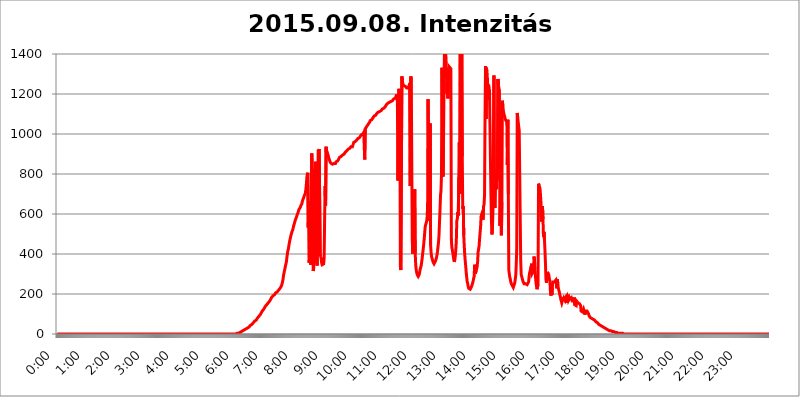
| Category | 2015.09.08. Intenzitás [W/m^2] |
|---|---|
| 0.0 | 0 |
| 0.0006944444444444445 | 0 |
| 0.001388888888888889 | 0 |
| 0.0020833333333333333 | 0 |
| 0.002777777777777778 | 0 |
| 0.003472222222222222 | 0 |
| 0.004166666666666667 | 0 |
| 0.004861111111111111 | 0 |
| 0.005555555555555556 | 0 |
| 0.0062499999999999995 | 0 |
| 0.006944444444444444 | 0 |
| 0.007638888888888889 | 0 |
| 0.008333333333333333 | 0 |
| 0.009027777777777779 | 0 |
| 0.009722222222222222 | 0 |
| 0.010416666666666666 | 0 |
| 0.011111111111111112 | 0 |
| 0.011805555555555555 | 0 |
| 0.012499999999999999 | 0 |
| 0.013194444444444444 | 0 |
| 0.013888888888888888 | 0 |
| 0.014583333333333332 | 0 |
| 0.015277777777777777 | 0 |
| 0.015972222222222224 | 0 |
| 0.016666666666666666 | 0 |
| 0.017361111111111112 | 0 |
| 0.018055555555555557 | 0 |
| 0.01875 | 0 |
| 0.019444444444444445 | 0 |
| 0.02013888888888889 | 0 |
| 0.020833333333333332 | 0 |
| 0.02152777777777778 | 0 |
| 0.022222222222222223 | 0 |
| 0.02291666666666667 | 0 |
| 0.02361111111111111 | 0 |
| 0.024305555555555556 | 0 |
| 0.024999999999999998 | 0 |
| 0.025694444444444447 | 0 |
| 0.02638888888888889 | 0 |
| 0.027083333333333334 | 0 |
| 0.027777777777777776 | 0 |
| 0.02847222222222222 | 0 |
| 0.029166666666666664 | 0 |
| 0.029861111111111113 | 0 |
| 0.030555555555555555 | 0 |
| 0.03125 | 0 |
| 0.03194444444444445 | 0 |
| 0.03263888888888889 | 0 |
| 0.03333333333333333 | 0 |
| 0.034027777777777775 | 0 |
| 0.034722222222222224 | 0 |
| 0.035416666666666666 | 0 |
| 0.036111111111111115 | 0 |
| 0.03680555555555556 | 0 |
| 0.0375 | 0 |
| 0.03819444444444444 | 0 |
| 0.03888888888888889 | 0 |
| 0.03958333333333333 | 0 |
| 0.04027777777777778 | 0 |
| 0.04097222222222222 | 0 |
| 0.041666666666666664 | 0 |
| 0.042361111111111106 | 0 |
| 0.04305555555555556 | 0 |
| 0.043750000000000004 | 0 |
| 0.044444444444444446 | 0 |
| 0.04513888888888889 | 0 |
| 0.04583333333333334 | 0 |
| 0.04652777777777778 | 0 |
| 0.04722222222222222 | 0 |
| 0.04791666666666666 | 0 |
| 0.04861111111111111 | 0 |
| 0.049305555555555554 | 0 |
| 0.049999999999999996 | 0 |
| 0.05069444444444445 | 0 |
| 0.051388888888888894 | 0 |
| 0.052083333333333336 | 0 |
| 0.05277777777777778 | 0 |
| 0.05347222222222222 | 0 |
| 0.05416666666666667 | 0 |
| 0.05486111111111111 | 0 |
| 0.05555555555555555 | 0 |
| 0.05625 | 0 |
| 0.05694444444444444 | 0 |
| 0.057638888888888885 | 0 |
| 0.05833333333333333 | 0 |
| 0.05902777777777778 | 0 |
| 0.059722222222222225 | 0 |
| 0.06041666666666667 | 0 |
| 0.061111111111111116 | 0 |
| 0.06180555555555556 | 0 |
| 0.0625 | 0 |
| 0.06319444444444444 | 0 |
| 0.06388888888888888 | 0 |
| 0.06458333333333334 | 0 |
| 0.06527777777777778 | 0 |
| 0.06597222222222222 | 0 |
| 0.06666666666666667 | 0 |
| 0.06736111111111111 | 0 |
| 0.06805555555555555 | 0 |
| 0.06874999999999999 | 0 |
| 0.06944444444444443 | 0 |
| 0.07013888888888889 | 0 |
| 0.07083333333333333 | 0 |
| 0.07152777777777779 | 0 |
| 0.07222222222222223 | 0 |
| 0.07291666666666667 | 0 |
| 0.07361111111111111 | 0 |
| 0.07430555555555556 | 0 |
| 0.075 | 0 |
| 0.07569444444444444 | 0 |
| 0.0763888888888889 | 0 |
| 0.07708333333333334 | 0 |
| 0.07777777777777778 | 0 |
| 0.07847222222222222 | 0 |
| 0.07916666666666666 | 0 |
| 0.0798611111111111 | 0 |
| 0.08055555555555556 | 0 |
| 0.08125 | 0 |
| 0.08194444444444444 | 0 |
| 0.08263888888888889 | 0 |
| 0.08333333333333333 | 0 |
| 0.08402777777777777 | 0 |
| 0.08472222222222221 | 0 |
| 0.08541666666666665 | 0 |
| 0.08611111111111112 | 0 |
| 0.08680555555555557 | 0 |
| 0.08750000000000001 | 0 |
| 0.08819444444444445 | 0 |
| 0.08888888888888889 | 0 |
| 0.08958333333333333 | 0 |
| 0.09027777777777778 | 0 |
| 0.09097222222222222 | 0 |
| 0.09166666666666667 | 0 |
| 0.09236111111111112 | 0 |
| 0.09305555555555556 | 0 |
| 0.09375 | 0 |
| 0.09444444444444444 | 0 |
| 0.09513888888888888 | 0 |
| 0.09583333333333333 | 0 |
| 0.09652777777777777 | 0 |
| 0.09722222222222222 | 0 |
| 0.09791666666666667 | 0 |
| 0.09861111111111111 | 0 |
| 0.09930555555555555 | 0 |
| 0.09999999999999999 | 0 |
| 0.10069444444444443 | 0 |
| 0.1013888888888889 | 0 |
| 0.10208333333333335 | 0 |
| 0.10277777777777779 | 0 |
| 0.10347222222222223 | 0 |
| 0.10416666666666667 | 0 |
| 0.10486111111111111 | 0 |
| 0.10555555555555556 | 0 |
| 0.10625 | 0 |
| 0.10694444444444444 | 0 |
| 0.1076388888888889 | 0 |
| 0.10833333333333334 | 0 |
| 0.10902777777777778 | 0 |
| 0.10972222222222222 | 0 |
| 0.1111111111111111 | 0 |
| 0.11180555555555556 | 0 |
| 0.11180555555555556 | 0 |
| 0.1125 | 0 |
| 0.11319444444444444 | 0 |
| 0.11388888888888889 | 0 |
| 0.11458333333333333 | 0 |
| 0.11527777777777777 | 0 |
| 0.11597222222222221 | 0 |
| 0.11666666666666665 | 0 |
| 0.1173611111111111 | 0 |
| 0.11805555555555557 | 0 |
| 0.11944444444444445 | 0 |
| 0.12013888888888889 | 0 |
| 0.12083333333333333 | 0 |
| 0.12152777777777778 | 0 |
| 0.12222222222222223 | 0 |
| 0.12291666666666667 | 0 |
| 0.12291666666666667 | 0 |
| 0.12361111111111112 | 0 |
| 0.12430555555555556 | 0 |
| 0.125 | 0 |
| 0.12569444444444444 | 0 |
| 0.12638888888888888 | 0 |
| 0.12708333333333333 | 0 |
| 0.16875 | 0 |
| 0.12847222222222224 | 0 |
| 0.12916666666666668 | 0 |
| 0.12986111111111112 | 0 |
| 0.13055555555555556 | 0 |
| 0.13125 | 0 |
| 0.13194444444444445 | 0 |
| 0.1326388888888889 | 0 |
| 0.13333333333333333 | 0 |
| 0.13402777777777777 | 0 |
| 0.13402777777777777 | 0 |
| 0.13472222222222222 | 0 |
| 0.13541666666666666 | 0 |
| 0.1361111111111111 | 0 |
| 0.13749999999999998 | 0 |
| 0.13819444444444443 | 0 |
| 0.1388888888888889 | 0 |
| 0.13958333333333334 | 0 |
| 0.14027777777777778 | 0 |
| 0.14097222222222222 | 0 |
| 0.14166666666666666 | 0 |
| 0.1423611111111111 | 0 |
| 0.14305555555555557 | 0 |
| 0.14375000000000002 | 0 |
| 0.14444444444444446 | 0 |
| 0.1451388888888889 | 0 |
| 0.1451388888888889 | 0 |
| 0.14652777777777778 | 0 |
| 0.14722222222222223 | 0 |
| 0.14791666666666667 | 0 |
| 0.1486111111111111 | 0 |
| 0.14930555555555555 | 0 |
| 0.15 | 0 |
| 0.15069444444444444 | 0 |
| 0.15138888888888888 | 0 |
| 0.15208333333333332 | 0 |
| 0.15277777777777776 | 0 |
| 0.15347222222222223 | 0 |
| 0.15416666666666667 | 0 |
| 0.15486111111111112 | 0 |
| 0.15555555555555556 | 0 |
| 0.15625 | 0 |
| 0.15694444444444444 | 0 |
| 0.15763888888888888 | 0 |
| 0.15833333333333333 | 0 |
| 0.15902777777777777 | 0 |
| 0.15972222222222224 | 0 |
| 0.16041666666666668 | 0 |
| 0.16111111111111112 | 0 |
| 0.16180555555555556 | 0 |
| 0.1625 | 0 |
| 0.16319444444444445 | 0 |
| 0.1638888888888889 | 0 |
| 0.16458333333333333 | 0 |
| 0.16527777777777777 | 0 |
| 0.16597222222222222 | 0 |
| 0.16666666666666666 | 0 |
| 0.1673611111111111 | 0 |
| 0.16805555555555554 | 0 |
| 0.16874999999999998 | 0 |
| 0.16944444444444443 | 0 |
| 0.17013888888888887 | 0 |
| 0.1708333333333333 | 0 |
| 0.17152777777777775 | 0 |
| 0.17222222222222225 | 0 |
| 0.1729166666666667 | 0 |
| 0.17361111111111113 | 0 |
| 0.17430555555555557 | 0 |
| 0.17500000000000002 | 0 |
| 0.17569444444444446 | 0 |
| 0.1763888888888889 | 0 |
| 0.17708333333333334 | 0 |
| 0.17777777777777778 | 0 |
| 0.17847222222222223 | 0 |
| 0.17916666666666667 | 0 |
| 0.1798611111111111 | 0 |
| 0.18055555555555555 | 0 |
| 0.18125 | 0 |
| 0.18194444444444444 | 0 |
| 0.1826388888888889 | 0 |
| 0.18333333333333335 | 0 |
| 0.1840277777777778 | 0 |
| 0.18472222222222223 | 0 |
| 0.18541666666666667 | 0 |
| 0.18611111111111112 | 0 |
| 0.18680555555555556 | 0 |
| 0.1875 | 0 |
| 0.18819444444444444 | 0 |
| 0.18888888888888888 | 0 |
| 0.18958333333333333 | 0 |
| 0.19027777777777777 | 0 |
| 0.1909722222222222 | 0 |
| 0.19166666666666665 | 0 |
| 0.19236111111111112 | 0 |
| 0.19305555555555554 | 0 |
| 0.19375 | 0 |
| 0.19444444444444445 | 0 |
| 0.1951388888888889 | 0 |
| 0.19583333333333333 | 0 |
| 0.19652777777777777 | 0 |
| 0.19722222222222222 | 0 |
| 0.19791666666666666 | 0 |
| 0.1986111111111111 | 0 |
| 0.19930555555555554 | 0 |
| 0.19999999999999998 | 0 |
| 0.20069444444444443 | 0 |
| 0.20138888888888887 | 0 |
| 0.2020833333333333 | 0 |
| 0.2027777777777778 | 0 |
| 0.2034722222222222 | 0 |
| 0.2041666666666667 | 0 |
| 0.20486111111111113 | 0 |
| 0.20555555555555557 | 0 |
| 0.20625000000000002 | 0 |
| 0.20694444444444446 | 0 |
| 0.2076388888888889 | 0 |
| 0.20833333333333334 | 0 |
| 0.20902777777777778 | 0 |
| 0.20972222222222223 | 0 |
| 0.21041666666666667 | 0 |
| 0.2111111111111111 | 0 |
| 0.21180555555555555 | 0 |
| 0.2125 | 0 |
| 0.21319444444444444 | 0 |
| 0.2138888888888889 | 0 |
| 0.21458333333333335 | 0 |
| 0.2152777777777778 | 0 |
| 0.21597222222222223 | 0 |
| 0.21666666666666667 | 0 |
| 0.21736111111111112 | 0 |
| 0.21805555555555556 | 0 |
| 0.21875 | 0 |
| 0.21944444444444444 | 0 |
| 0.22013888888888888 | 0 |
| 0.22083333333333333 | 0 |
| 0.22152777777777777 | 0 |
| 0.2222222222222222 | 0 |
| 0.22291666666666665 | 0 |
| 0.2236111111111111 | 0 |
| 0.22430555555555556 | 0 |
| 0.225 | 0 |
| 0.22569444444444445 | 0 |
| 0.2263888888888889 | 0 |
| 0.22708333333333333 | 0 |
| 0.22777777777777777 | 0 |
| 0.22847222222222222 | 0 |
| 0.22916666666666666 | 0 |
| 0.2298611111111111 | 0 |
| 0.23055555555555554 | 0 |
| 0.23124999999999998 | 0 |
| 0.23194444444444443 | 0 |
| 0.23263888888888887 | 0 |
| 0.2333333333333333 | 0 |
| 0.2340277777777778 | 0 |
| 0.2347222222222222 | 0 |
| 0.2354166666666667 | 0 |
| 0.23611111111111113 | 0 |
| 0.23680555555555557 | 0 |
| 0.23750000000000002 | 0 |
| 0.23819444444444446 | 0 |
| 0.2388888888888889 | 0 |
| 0.23958333333333334 | 0 |
| 0.24027777777777778 | 0 |
| 0.24097222222222223 | 0 |
| 0.24166666666666667 | 0 |
| 0.2423611111111111 | 0 |
| 0.24305555555555555 | 0 |
| 0.24375 | 0 |
| 0.24444444444444446 | 0 |
| 0.24513888888888888 | 0 |
| 0.24583333333333335 | 0 |
| 0.2465277777777778 | 0 |
| 0.24722222222222223 | 0 |
| 0.24791666666666667 | 0 |
| 0.24861111111111112 | 0 |
| 0.24930555555555556 | 0 |
| 0.25 | 0 |
| 0.25069444444444444 | 0 |
| 0.2513888888888889 | 3.525 |
| 0.2520833333333333 | 3.525 |
| 0.25277777777777777 | 3.525 |
| 0.2534722222222222 | 3.525 |
| 0.25416666666666665 | 3.525 |
| 0.2548611111111111 | 3.525 |
| 0.2555555555555556 | 7.887 |
| 0.25625000000000003 | 7.887 |
| 0.2569444444444445 | 7.887 |
| 0.2576388888888889 | 12.257 |
| 0.25833333333333336 | 12.257 |
| 0.2590277777777778 | 12.257 |
| 0.25972222222222224 | 12.257 |
| 0.2604166666666667 | 16.636 |
| 0.2611111111111111 | 16.636 |
| 0.26180555555555557 | 21.024 |
| 0.2625 | 21.024 |
| 0.26319444444444445 | 21.024 |
| 0.2638888888888889 | 21.024 |
| 0.26458333333333334 | 25.419 |
| 0.2652777777777778 | 25.419 |
| 0.2659722222222222 | 29.823 |
| 0.26666666666666666 | 29.823 |
| 0.2673611111111111 | 29.823 |
| 0.26805555555555555 | 34.234 |
| 0.26875 | 34.234 |
| 0.26944444444444443 | 38.653 |
| 0.2701388888888889 | 38.653 |
| 0.2708333333333333 | 43.079 |
| 0.27152777777777776 | 43.079 |
| 0.2722222222222222 | 47.511 |
| 0.27291666666666664 | 47.511 |
| 0.2736111111111111 | 51.951 |
| 0.2743055555555555 | 51.951 |
| 0.27499999999999997 | 56.398 |
| 0.27569444444444446 | 60.85 |
| 0.27638888888888885 | 60.85 |
| 0.27708333333333335 | 65.31 |
| 0.2777777777777778 | 65.31 |
| 0.27847222222222223 | 69.775 |
| 0.2791666666666667 | 69.775 |
| 0.2798611111111111 | 74.246 |
| 0.28055555555555556 | 78.722 |
| 0.28125 | 83.205 |
| 0.28194444444444444 | 83.205 |
| 0.2826388888888889 | 87.692 |
| 0.2833333333333333 | 92.184 |
| 0.28402777777777777 | 92.184 |
| 0.2847222222222222 | 96.682 |
| 0.28541666666666665 | 101.184 |
| 0.28611111111111115 | 105.69 |
| 0.28680555555555554 | 110.201 |
| 0.28750000000000003 | 114.716 |
| 0.2881944444444445 | 119.235 |
| 0.2888888888888889 | 119.235 |
| 0.28958333333333336 | 123.758 |
| 0.2902777777777778 | 128.284 |
| 0.29097222222222224 | 128.284 |
| 0.2916666666666667 | 137.347 |
| 0.2923611111111111 | 137.347 |
| 0.29305555555555557 | 141.884 |
| 0.29375 | 146.423 |
| 0.29444444444444445 | 146.423 |
| 0.2951388888888889 | 150.964 |
| 0.29583333333333334 | 155.509 |
| 0.2965277777777778 | 155.509 |
| 0.2972222222222222 | 160.056 |
| 0.29791666666666666 | 164.605 |
| 0.2986111111111111 | 169.156 |
| 0.29930555555555555 | 173.709 |
| 0.3 | 178.264 |
| 0.30069444444444443 | 182.82 |
| 0.3013888888888889 | 182.82 |
| 0.3020833333333333 | 187.378 |
| 0.30277777777777776 | 191.937 |
| 0.3034722222222222 | 196.497 |
| 0.30416666666666664 | 196.497 |
| 0.3048611111111111 | 196.497 |
| 0.3055555555555555 | 201.058 |
| 0.30624999999999997 | 205.62 |
| 0.3069444444444444 | 205.62 |
| 0.3076388888888889 | 210.182 |
| 0.30833333333333335 | 210.182 |
| 0.3090277777777778 | 210.182 |
| 0.30972222222222223 | 210.182 |
| 0.3104166666666667 | 219.309 |
| 0.3111111111111111 | 219.309 |
| 0.31180555555555556 | 223.873 |
| 0.3125 | 228.436 |
| 0.31319444444444444 | 233 |
| 0.3138888888888889 | 233 |
| 0.3145833333333333 | 242.127 |
| 0.31527777777777777 | 251.251 |
| 0.3159722222222222 | 260.373 |
| 0.31666666666666665 | 274.047 |
| 0.31736111111111115 | 292.259 |
| 0.31805555555555554 | 305.898 |
| 0.31875000000000003 | 310.44 |
| 0.3194444444444445 | 328.584 |
| 0.3201388888888889 | 342.162 |
| 0.32083333333333336 | 351.198 |
| 0.3215277777777778 | 364.728 |
| 0.32222222222222224 | 387.202 |
| 0.3229166666666667 | 405.108 |
| 0.3236111111111111 | 418.492 |
| 0.32430555555555557 | 427.39 |
| 0.325 | 445.129 |
| 0.32569444444444445 | 458.38 |
| 0.3263888888888889 | 471.582 |
| 0.32708333333333334 | 475.972 |
| 0.3277777777777778 | 493.475 |
| 0.3284722222222222 | 502.192 |
| 0.32916666666666666 | 510.885 |
| 0.3298611111111111 | 515.223 |
| 0.33055555555555555 | 523.88 |
| 0.33125 | 536.82 |
| 0.33194444444444443 | 545.416 |
| 0.3326388888888889 | 553.986 |
| 0.3333333333333333 | 562.53 |
| 0.3340277777777778 | 571.049 |
| 0.3347222222222222 | 575.299 |
| 0.3354166666666667 | 583.779 |
| 0.3361111111111111 | 592.233 |
| 0.3368055555555556 | 596.45 |
| 0.33749999999999997 | 604.864 |
| 0.33819444444444446 | 609.062 |
| 0.33888888888888885 | 621.613 |
| 0.33958333333333335 | 621.613 |
| 0.34027777777777773 | 625.784 |
| 0.34097222222222223 | 634.105 |
| 0.3416666666666666 | 642.4 |
| 0.3423611111111111 | 646.537 |
| 0.3430555555555555 | 650.667 |
| 0.34375 | 663.019 |
| 0.3444444444444445 | 671.22 |
| 0.3451388888888889 | 667.123 |
| 0.3458333333333334 | 683.473 |
| 0.34652777777777777 | 691.608 |
| 0.34722222222222227 | 687.544 |
| 0.34791666666666665 | 703.762 |
| 0.34861111111111115 | 719.877 |
| 0.34930555555555554 | 743.859 |
| 0.35000000000000003 | 779.42 |
| 0.3506944444444444 | 798.974 |
| 0.3513888888888889 | 806.757 |
| 0.3520833333333333 | 532.513 |
| 0.3527777777777778 | 663.019 |
| 0.3534722222222222 | 355.712 |
| 0.3541666666666667 | 422.943 |
| 0.3548611111111111 | 369.23 |
| 0.35555555555555557 | 346.682 |
| 0.35625 | 342.162 |
| 0.35694444444444445 | 902.447 |
| 0.3576388888888889 | 802.868 |
| 0.35833333333333334 | 549.704 |
| 0.3590277777777778 | 314.98 |
| 0.3597222222222222 | 333.113 |
| 0.36041666666666666 | 822.26 |
| 0.3611111111111111 | 695.666 |
| 0.36180555555555555 | 440.702 |
| 0.3625 | 860.676 |
| 0.36319444444444443 | 378.224 |
| 0.3638888888888889 | 351.198 |
| 0.3645833333333333 | 342.162 |
| 0.3652777777777778 | 480.356 |
| 0.3659722222222222 | 921.298 |
| 0.3666666666666667 | 913.766 |
| 0.3673611111111111 | 925.06 |
| 0.3680555555555556 | 928.819 |
| 0.36874999999999997 | 405.108 |
| 0.36944444444444446 | 387.202 |
| 0.37013888888888885 | 378.224 |
| 0.37083333333333335 | 355.712 |
| 0.37152777777777773 | 346.682 |
| 0.37222222222222223 | 346.682 |
| 0.3729166666666666 | 351.198 |
| 0.3736111111111111 | 351.198 |
| 0.3743055555555555 | 378.224 |
| 0.375 | 575.299 |
| 0.3756944444444445 | 739.877 |
| 0.3763888888888889 | 642.4 |
| 0.3770833333333334 | 936.33 |
| 0.37777777777777777 | 887.309 |
| 0.37847222222222227 | 894.885 |
| 0.37916666666666665 | 902.447 |
| 0.37986111111111115 | 894.885 |
| 0.38055555555555554 | 883.516 |
| 0.38125000000000003 | 879.719 |
| 0.3819444444444444 | 868.305 |
| 0.3826388888888889 | 860.676 |
| 0.3833333333333333 | 860.676 |
| 0.3840277777777778 | 853.029 |
| 0.3847222222222222 | 853.029 |
| 0.3854166666666667 | 853.029 |
| 0.3861111111111111 | 849.199 |
| 0.38680555555555557 | 849.199 |
| 0.3875 | 849.199 |
| 0.38819444444444445 | 853.029 |
| 0.3888888888888889 | 853.029 |
| 0.38958333333333334 | 853.029 |
| 0.3902777777777778 | 853.029 |
| 0.3909722222222222 | 860.676 |
| 0.39166666666666666 | 860.676 |
| 0.3923611111111111 | 864.493 |
| 0.39305555555555555 | 864.493 |
| 0.39375 | 868.305 |
| 0.39444444444444443 | 872.114 |
| 0.3951388888888889 | 875.918 |
| 0.3958333333333333 | 883.516 |
| 0.3965277777777778 | 883.516 |
| 0.3972222222222222 | 883.516 |
| 0.3979166666666667 | 887.309 |
| 0.3986111111111111 | 887.309 |
| 0.3993055555555556 | 887.309 |
| 0.39999999999999997 | 894.885 |
| 0.40069444444444446 | 894.885 |
| 0.40138888888888885 | 898.668 |
| 0.40208333333333335 | 898.668 |
| 0.40277777777777773 | 898.668 |
| 0.40347222222222223 | 902.447 |
| 0.4041666666666666 | 909.996 |
| 0.4048611111111111 | 906.223 |
| 0.4055555555555555 | 913.766 |
| 0.40625 | 917.534 |
| 0.4069444444444445 | 921.298 |
| 0.4076388888888889 | 921.298 |
| 0.4083333333333334 | 925.06 |
| 0.40902777777777777 | 925.06 |
| 0.40972222222222227 | 925.06 |
| 0.41041666666666665 | 928.819 |
| 0.41111111111111115 | 928.819 |
| 0.41180555555555554 | 936.33 |
| 0.41250000000000003 | 940.082 |
| 0.4131944444444444 | 936.33 |
| 0.4138888888888889 | 936.33 |
| 0.4145833333333333 | 943.832 |
| 0.4152777777777778 | 947.58 |
| 0.4159722222222222 | 958.814 |
| 0.4166666666666667 | 958.814 |
| 0.4173611111111111 | 958.814 |
| 0.41805555555555557 | 962.555 |
| 0.41875 | 966.295 |
| 0.41944444444444445 | 966.295 |
| 0.4201388888888889 | 970.034 |
| 0.42083333333333334 | 973.772 |
| 0.4215277777777778 | 977.508 |
| 0.4222222222222222 | 977.508 |
| 0.42291666666666666 | 981.244 |
| 0.4236111111111111 | 981.244 |
| 0.42430555555555555 | 981.244 |
| 0.425 | 988.714 |
| 0.42569444444444443 | 992.448 |
| 0.4263888888888889 | 996.182 |
| 0.4270833333333333 | 999.916 |
| 0.4277777777777778 | 999.916 |
| 0.4284722222222222 | 999.916 |
| 0.4291666666666667 | 1003.65 |
| 0.4298611111111111 | 1007.383 |
| 0.4305555555555556 | 1011.118 |
| 0.43124999999999997 | 872.114 |
| 0.43194444444444446 | 1026.06 |
| 0.43263888888888885 | 1029.798 |
| 0.43333333333333335 | 1033.537 |
| 0.43402777777777773 | 1037.277 |
| 0.43472222222222223 | 1041.019 |
| 0.4354166666666666 | 1044.762 |
| 0.4361111111111111 | 1048.508 |
| 0.4368055555555555 | 1052.255 |
| 0.4375 | 1052.255 |
| 0.4381944444444445 | 1059.756 |
| 0.4388888888888889 | 1067.267 |
| 0.4395833333333334 | 1063.51 |
| 0.44027777777777777 | 1067.267 |
| 0.44097222222222227 | 1071.027 |
| 0.44166666666666665 | 1074.789 |
| 0.44236111111111115 | 1078.555 |
| 0.44305555555555554 | 1078.555 |
| 0.44375000000000003 | 1082.324 |
| 0.4444444444444444 | 1089.873 |
| 0.4451388888888889 | 1089.873 |
| 0.4458333333333333 | 1089.873 |
| 0.4465277777777778 | 1093.653 |
| 0.4472222222222222 | 1097.437 |
| 0.4479166666666667 | 1101.226 |
| 0.4486111111111111 | 1105.019 |
| 0.44930555555555557 | 1105.019 |
| 0.45 | 1108.816 |
| 0.45069444444444445 | 1108.816 |
| 0.4513888888888889 | 1108.816 |
| 0.45208333333333334 | 1112.618 |
| 0.4527777777777778 | 1116.426 |
| 0.4534722222222222 | 1112.618 |
| 0.45416666666666666 | 1116.426 |
| 0.4548611111111111 | 1120.238 |
| 0.45555555555555555 | 1124.056 |
| 0.45625 | 1124.056 |
| 0.45694444444444443 | 1127.879 |
| 0.4576388888888889 | 1127.879 |
| 0.4583333333333333 | 1131.708 |
| 0.4590277777777778 | 1131.708 |
| 0.4597222222222222 | 1135.543 |
| 0.4604166666666667 | 1139.384 |
| 0.4611111111111111 | 1139.384 |
| 0.4618055555555556 | 1147.086 |
| 0.46249999999999997 | 1147.086 |
| 0.46319444444444446 | 1147.086 |
| 0.46388888888888885 | 1154.814 |
| 0.46458333333333335 | 1154.814 |
| 0.46527777777777773 | 1158.689 |
| 0.46597222222222223 | 1158.689 |
| 0.4666666666666666 | 1162.571 |
| 0.4673611111111111 | 1162.571 |
| 0.4680555555555555 | 1162.571 |
| 0.46875 | 1158.689 |
| 0.4694444444444445 | 1158.689 |
| 0.4701388888888889 | 1166.46 |
| 0.4708333333333334 | 1170.358 |
| 0.47152777777777777 | 1174.263 |
| 0.47222222222222227 | 1174.263 |
| 0.47291666666666665 | 1174.263 |
| 0.47361111111111115 | 1178.177 |
| 0.47430555555555554 | 1178.177 |
| 0.47500000000000003 | 1186.03 |
| 0.4756944444444444 | 1197.876 |
| 0.4763888888888889 | 1201.843 |
| 0.4770833333333333 | 1166.46 |
| 0.4777777777777778 | 767.62 |
| 0.4784722222222222 | 992.448 |
| 0.4791666666666667 | 1225.859 |
| 0.4798611111111111 | 1225.859 |
| 0.48055555555555557 | 1078.555 |
| 0.48125 | 337.639 |
| 0.48194444444444445 | 319.517 |
| 0.4826388888888889 | 324.052 |
| 0.48333333333333334 | 1287.761 |
| 0.4840277777777778 | 1266.8 |
| 0.4847222222222222 | 1250.275 |
| 0.48541666666666666 | 1246.176 |
| 0.4861111111111111 | 1242.089 |
| 0.48680555555555555 | 1246.176 |
| 0.4875 | 1238.014 |
| 0.48819444444444443 | 1238.014 |
| 0.4888888888888889 | 1238.014 |
| 0.4895833333333333 | 1233.951 |
| 0.4902777777777778 | 1229.899 |
| 0.4909722222222222 | 1225.859 |
| 0.4916666666666667 | 1225.859 |
| 0.4923611111111111 | 1229.899 |
| 0.4930555555555556 | 1233.951 |
| 0.49374999999999997 | 1246.176 |
| 0.49444444444444446 | 1254.387 |
| 0.49513888888888885 | 739.877 |
| 0.49583333333333335 | 1287.761 |
| 0.49652777777777773 | 1270.964 |
| 0.49722222222222223 | 1266.8 |
| 0.4979166666666666 | 471.582 |
| 0.4986111111111111 | 400.638 |
| 0.4993055555555555 | 471.582 |
| 0.5 | 484.735 |
| 0.5006944444444444 | 493.475 |
| 0.5013888888888889 | 723.889 |
| 0.5020833333333333 | 400.638 |
| 0.5027777777777778 | 346.682 |
| 0.5034722222222222 | 319.517 |
| 0.5041666666666667 | 305.898 |
| 0.5048611111111111 | 296.808 |
| 0.5055555555555555 | 292.259 |
| 0.50625 | 287.709 |
| 0.5069444444444444 | 292.259 |
| 0.5076388888888889 | 296.808 |
| 0.5083333333333333 | 310.44 |
| 0.5090277777777777 | 324.052 |
| 0.5097222222222222 | 333.113 |
| 0.5104166666666666 | 342.162 |
| 0.5111111111111112 | 360.221 |
| 0.5118055555555555 | 378.224 |
| 0.5125000000000001 | 400.638 |
| 0.5131944444444444 | 422.943 |
| 0.513888888888889 | 445.129 |
| 0.5145833333333333 | 471.582 |
| 0.5152777777777778 | 502.192 |
| 0.5159722222222222 | 532.513 |
| 0.5166666666666667 | 545.416 |
| 0.517361111111111 | 553.986 |
| 0.5180555555555556 | 562.53 |
| 0.5187499999999999 | 583.779 |
| 0.5194444444444445 | 638.256 |
| 0.5201388888888888 | 1174.263 |
| 0.5208333333333334 | 634.105 |
| 0.5215277777777778 | 629.948 |
| 0.5222222222222223 | 566.793 |
| 0.5229166666666667 | 1052.255 |
| 0.5236111111111111 | 445.129 |
| 0.5243055555555556 | 409.574 |
| 0.525 | 387.202 |
| 0.5256944444444445 | 378.224 |
| 0.5263888888888889 | 369.23 |
| 0.5270833333333333 | 360.221 |
| 0.5277777777777778 | 360.221 |
| 0.5284722222222222 | 351.198 |
| 0.5291666666666667 | 351.198 |
| 0.5298611111111111 | 355.712 |
| 0.5305555555555556 | 364.728 |
| 0.53125 | 373.729 |
| 0.5319444444444444 | 382.715 |
| 0.5326388888888889 | 396.164 |
| 0.5333333333333333 | 414.035 |
| 0.5340277777777778 | 436.27 |
| 0.5347222222222222 | 458.38 |
| 0.5354166666666667 | 493.475 |
| 0.5361111111111111 | 558.261 |
| 0.5368055555555555 | 617.436 |
| 0.5375 | 691.608 |
| 0.5381944444444444 | 715.858 |
| 0.5388888888888889 | 795.074 |
| 0.5395833333333333 | 1330.826 |
| 0.5402777777777777 | 1330.826 |
| 0.5409722222222222 | 787.258 |
| 0.5416666666666666 | 936.33 |
| 0.5423611111111112 | 1201.843 |
| 0.5430555555555555 | 1422.462 |
| 0.5437500000000001 | 1436.949 |
| 0.5444444444444444 | 1408.184 |
| 0.545138888888889 | 1384.828 |
| 0.5458333333333333 | 1326.445 |
| 0.5465277777777778 | 1201.843 |
| 0.5472222222222222 | 1330.826 |
| 0.5479166666666667 | 1178.177 |
| 0.548611111111111 | 1287.761 |
| 0.5493055555555556 | 1279.334 |
| 0.5499999999999999 | 1335.223 |
| 0.5506944444444445 | 1339.639 |
| 0.5513888888888888 | 1339.639 |
| 0.5520833333333334 | 1326.445 |
| 0.5527777777777778 | 471.582 |
| 0.5534722222222223 | 431.833 |
| 0.5541666666666667 | 418.492 |
| 0.5548611111111111 | 405.108 |
| 0.5555555555555556 | 387.202 |
| 0.55625 | 369.23 |
| 0.5569444444444445 | 360.221 |
| 0.5576388888888889 | 373.729 |
| 0.5583333333333333 | 391.685 |
| 0.5590277777777778 | 422.943 |
| 0.5597222222222222 | 467.187 |
| 0.5604166666666667 | 566.793 |
| 0.5611111111111111 | 575.299 |
| 0.5618055555555556 | 609.062 |
| 0.5625 | 592.233 |
| 0.5631944444444444 | 783.342 |
| 0.5638888888888889 | 958.814 |
| 0.5645833333333333 | 699.717 |
| 0.5652777777777778 | 1461.58 |
| 0.5659722222222222 | 887.309 |
| 0.5666666666666667 | 1143.232 |
| 0.5673611111111111 | 1422.462 |
| 0.5680555555555555 | 887.309 |
| 0.56875 | 625.784 |
| 0.5694444444444444 | 638.256 |
| 0.5701388888888889 | 493.475 |
| 0.5708333333333333 | 440.702 |
| 0.5715277777777777 | 396.164 |
| 0.5722222222222222 | 364.728 |
| 0.5729166666666666 | 337.639 |
| 0.5736111111111112 | 305.898 |
| 0.5743055555555555 | 283.156 |
| 0.5750000000000001 | 260.373 |
| 0.5756944444444444 | 251.251 |
| 0.576388888888889 | 237.564 |
| 0.5770833333333333 | 228.436 |
| 0.5777777777777778 | 223.873 |
| 0.5784722222222222 | 223.873 |
| 0.5791666666666667 | 223.873 |
| 0.579861111111111 | 223.873 |
| 0.5805555555555556 | 233 |
| 0.5812499999999999 | 237.564 |
| 0.5819444444444445 | 246.689 |
| 0.5826388888888888 | 251.251 |
| 0.5833333333333334 | 264.932 |
| 0.5840277777777778 | 278.603 |
| 0.5847222222222223 | 287.709 |
| 0.5854166666666667 | 346.682 |
| 0.5861111111111111 | 301.354 |
| 0.5868055555555556 | 305.898 |
| 0.5875 | 314.98 |
| 0.5881944444444445 | 324.052 |
| 0.5888888888888889 | 337.639 |
| 0.5895833333333333 | 360.221 |
| 0.5902777777777778 | 409.574 |
| 0.5909722222222222 | 405.108 |
| 0.5916666666666667 | 440.702 |
| 0.5923611111111111 | 475.972 |
| 0.5930555555555556 | 506.542 |
| 0.59375 | 536.82 |
| 0.5944444444444444 | 588.009 |
| 0.5951388888888889 | 596.45 |
| 0.5958333333333333 | 600.661 |
| 0.5965277777777778 | 579.542 |
| 0.5972222222222222 | 571.049 |
| 0.5979166666666667 | 638.256 |
| 0.5986111111111111 | 646.537 |
| 0.5993055555555555 | 695.666 |
| 0.6 | 1089.873 |
| 0.6006944444444444 | 1339.639 |
| 0.6013888888888889 | 1074.789 |
| 0.6020833333333333 | 1330.826 |
| 0.6027777777777777 | 1291.997 |
| 0.6034722222222222 | 1275.142 |
| 0.6041666666666666 | 1170.358 |
| 0.6048611111111112 | 1246.176 |
| 0.6055555555555555 | 1229.899 |
| 0.6062500000000001 | 1217.812 |
| 0.6069444444444444 | 1213.804 |
| 0.607638888888889 | 853.029 |
| 0.6083333333333333 | 687.544 |
| 0.6090277777777778 | 558.261 |
| 0.6097222222222222 | 497.836 |
| 0.6104166666666667 | 536.82 |
| 0.611111111111111 | 617.436 |
| 0.6118055555555556 | 992.448 |
| 0.6124999999999999 | 1291.997 |
| 0.6131944444444445 | 654.791 |
| 0.6138888888888888 | 629.948 |
| 0.6145833333333334 | 791.169 |
| 0.6152777777777778 | 743.859 |
| 0.6159722222222223 | 723.889 |
| 0.6166666666666667 | 822.26 |
| 0.6173611111111111 | 771.559 |
| 0.6180555555555556 | 1275.142 |
| 0.61875 | 1242.089 |
| 0.6194444444444445 | 1242.089 |
| 0.6201388888888889 | 1217.812 |
| 0.6208333333333333 | 541.121 |
| 0.6215277777777778 | 638.256 |
| 0.6222222222222222 | 1003.65 |
| 0.6229166666666667 | 493.475 |
| 0.6236111111111111 | 658.909 |
| 0.6243055555555556 | 1166.46 |
| 0.625 | 1139.384 |
| 0.6256944444444444 | 1116.426 |
| 0.6263888888888889 | 1101.226 |
| 0.6270833333333333 | 1093.653 |
| 0.6277777777777778 | 1082.324 |
| 0.6284722222222222 | 1078.555 |
| 0.6291666666666667 | 1067.267 |
| 0.6298611111111111 | 1067.267 |
| 0.6305555555555555 | 1059.756 |
| 0.63125 | 845.365 |
| 0.6319444444444444 | 1071.027 |
| 0.6326388888888889 | 699.717 |
| 0.6333333333333333 | 319.517 |
| 0.6340277777777777 | 301.354 |
| 0.6347222222222222 | 283.156 |
| 0.6354166666666666 | 274.047 |
| 0.6361111111111112 | 260.373 |
| 0.6368055555555555 | 251.251 |
| 0.6375000000000001 | 246.689 |
| 0.6381944444444444 | 242.127 |
| 0.638888888888889 | 237.564 |
| 0.6395833333333333 | 233 |
| 0.6402777777777778 | 228.436 |
| 0.6409722222222222 | 233 |
| 0.6416666666666667 | 255.813 |
| 0.642361111111111 | 260.373 |
| 0.6430555555555556 | 292.259 |
| 0.6437499999999999 | 346.682 |
| 0.6444444444444445 | 427.39 |
| 0.6451388888888888 | 1105.019 |
| 0.6458333333333334 | 1082.324 |
| 0.6465277777777778 | 1059.756 |
| 0.6472222222222223 | 1037.277 |
| 0.6479166666666667 | 1018.587 |
| 0.6486111111111111 | 1018.587 |
| 0.6493055555555556 | 1014.852 |
| 0.65 | 369.23 |
| 0.6506944444444445 | 296.808 |
| 0.6513888888888889 | 287.709 |
| 0.6520833333333333 | 278.603 |
| 0.6527777777777778 | 269.49 |
| 0.6534722222222222 | 260.373 |
| 0.6541666666666667 | 255.813 |
| 0.6548611111111111 | 251.251 |
| 0.6555555555555556 | 251.251 |
| 0.65625 | 251.251 |
| 0.6569444444444444 | 251.251 |
| 0.6576388888888889 | 251.251 |
| 0.6583333333333333 | 251.251 |
| 0.6590277777777778 | 246.689 |
| 0.6597222222222222 | 242.127 |
| 0.6604166666666667 | 251.251 |
| 0.6611111111111111 | 260.373 |
| 0.6618055555555555 | 287.709 |
| 0.6625 | 305.898 |
| 0.6631944444444444 | 314.98 |
| 0.6638888888888889 | 305.898 |
| 0.6645833333333333 | 310.44 |
| 0.6652777777777777 | 351.198 |
| 0.6659722222222222 | 301.354 |
| 0.6666666666666666 | 301.354 |
| 0.6673611111111111 | 310.44 |
| 0.6680555555555556 | 319.517 |
| 0.6687500000000001 | 387.202 |
| 0.6694444444444444 | 364.728 |
| 0.6701388888888888 | 319.517 |
| 0.6708333333333334 | 283.156 |
| 0.6715277777777778 | 255.813 |
| 0.6722222222222222 | 237.564 |
| 0.6729166666666666 | 223.873 |
| 0.6736111111111112 | 223.873 |
| 0.6743055555555556 | 246.689 |
| 0.6749999999999999 | 751.803 |
| 0.6756944444444444 | 743.859 |
| 0.6763888888888889 | 743.859 |
| 0.6770833333333334 | 727.896 |
| 0.6777777777777777 | 695.666 |
| 0.6784722222222223 | 654.791 |
| 0.6791666666666667 | 562.53 |
| 0.6798611111111111 | 621.613 |
| 0.6805555555555555 | 638.256 |
| 0.68125 | 575.299 |
| 0.6819444444444445 | 484.735 |
| 0.6826388888888889 | 510.885 |
| 0.6833333333333332 | 471.582 |
| 0.6840277777777778 | 418.492 |
| 0.6847222222222222 | 355.712 |
| 0.6854166666666667 | 274.047 |
| 0.686111111111111 | 255.813 |
| 0.6868055555555556 | 255.813 |
| 0.6875 | 310.44 |
| 0.6881944444444444 | 314.98 |
| 0.688888888888889 | 305.898 |
| 0.6895833333333333 | 292.259 |
| 0.6902777777777778 | 274.047 |
| 0.6909722222222222 | 264.932 |
| 0.6916666666666668 | 214.746 |
| 0.6923611111111111 | 191.937 |
| 0.6930555555555555 | 251.251 |
| 0.69375 | 196.497 |
| 0.6944444444444445 | 246.689 |
| 0.6951388888888889 | 260.373 |
| 0.6958333333333333 | 260.373 |
| 0.6965277777777777 | 260.373 |
| 0.6972222222222223 | 260.373 |
| 0.6979166666666666 | 260.373 |
| 0.6986111111111111 | 264.932 |
| 0.6993055555555556 | 269.49 |
| 0.7000000000000001 | 269.49 |
| 0.7006944444444444 | 228.436 |
| 0.7013888888888888 | 274.047 |
| 0.7020833333333334 | 251.251 |
| 0.7027777777777778 | 228.436 |
| 0.7034722222222222 | 219.309 |
| 0.7041666666666666 | 210.182 |
| 0.7048611111111112 | 196.497 |
| 0.7055555555555556 | 187.378 |
| 0.7062499999999999 | 173.709 |
| 0.7069444444444444 | 164.605 |
| 0.7076388888888889 | 155.509 |
| 0.7083333333333334 | 164.605 |
| 0.7090277777777777 | 182.82 |
| 0.7097222222222223 | 169.156 |
| 0.7104166666666667 | 178.264 |
| 0.7111111111111111 | 178.264 |
| 0.7118055555555555 | 169.156 |
| 0.7125 | 182.82 |
| 0.7131944444444445 | 178.264 |
| 0.7138888888888889 | 182.82 |
| 0.7145833333333332 | 191.937 |
| 0.7152777777777778 | 155.509 |
| 0.7159722222222222 | 155.509 |
| 0.7166666666666667 | 196.497 |
| 0.717361111111111 | 169.156 |
| 0.7180555555555556 | 173.709 |
| 0.71875 | 178.264 |
| 0.7194444444444444 | 182.82 |
| 0.720138888888889 | 182.82 |
| 0.7208333333333333 | 182.82 |
| 0.7215277777777778 | 173.709 |
| 0.7222222222222222 | 164.605 |
| 0.7229166666666668 | 164.605 |
| 0.7236111111111111 | 160.056 |
| 0.7243055555555555 | 164.605 |
| 0.725 | 182.82 |
| 0.7256944444444445 | 146.423 |
| 0.7263888888888889 | 150.964 |
| 0.7270833333333333 | 146.423 |
| 0.7277777777777777 | 141.884 |
| 0.7284722222222223 | 164.605 |
| 0.7291666666666666 | 169.156 |
| 0.7298611111111111 | 164.605 |
| 0.7305555555555556 | 155.509 |
| 0.7312500000000001 | 155.509 |
| 0.7319444444444444 | 150.964 |
| 0.7326388888888888 | 150.964 |
| 0.7333333333333334 | 150.964 |
| 0.7340277777777778 | 141.884 |
| 0.7347222222222222 | 114.716 |
| 0.7354166666666666 | 110.201 |
| 0.7361111111111112 | 110.201 |
| 0.7368055555555556 | 110.201 |
| 0.7374999999999999 | 110.201 |
| 0.7381944444444444 | 123.758 |
| 0.7388888888888889 | 123.758 |
| 0.7395833333333334 | 119.235 |
| 0.7402777777777777 | 96.682 |
| 0.7409722222222223 | 114.716 |
| 0.7416666666666667 | 114.716 |
| 0.7423611111111111 | 114.716 |
| 0.7430555555555555 | 114.716 |
| 0.74375 | 110.201 |
| 0.7444444444444445 | 110.201 |
| 0.7451388888888889 | 101.184 |
| 0.7458333333333332 | 92.184 |
| 0.7465277777777778 | 87.692 |
| 0.7472222222222222 | 83.205 |
| 0.7479166666666667 | 83.205 |
| 0.748611111111111 | 78.722 |
| 0.7493055555555556 | 78.722 |
| 0.75 | 74.246 |
| 0.7506944444444444 | 74.246 |
| 0.751388888888889 | 74.246 |
| 0.7520833333333333 | 74.246 |
| 0.7527777777777778 | 69.775 |
| 0.7534722222222222 | 69.775 |
| 0.7541666666666668 | 65.31 |
| 0.7548611111111111 | 65.31 |
| 0.7555555555555555 | 60.85 |
| 0.75625 | 56.398 |
| 0.7569444444444445 | 56.398 |
| 0.7576388888888889 | 56.398 |
| 0.7583333333333333 | 56.398 |
| 0.7590277777777777 | 51.951 |
| 0.7597222222222223 | 47.511 |
| 0.7604166666666666 | 47.511 |
| 0.7611111111111111 | 43.079 |
| 0.7618055555555556 | 43.079 |
| 0.7625000000000001 | 43.079 |
| 0.7631944444444444 | 38.653 |
| 0.7638888888888888 | 38.653 |
| 0.7645833333333334 | 34.234 |
| 0.7652777777777778 | 34.234 |
| 0.7659722222222222 | 34.234 |
| 0.7666666666666666 | 29.823 |
| 0.7673611111111112 | 29.823 |
| 0.7680555555555556 | 29.823 |
| 0.7687499999999999 | 29.823 |
| 0.7694444444444444 | 25.419 |
| 0.7701388888888889 | 25.419 |
| 0.7708333333333334 | 21.024 |
| 0.7715277777777777 | 21.024 |
| 0.7722222222222223 | 21.024 |
| 0.7729166666666667 | 21.024 |
| 0.7736111111111111 | 16.636 |
| 0.7743055555555555 | 16.636 |
| 0.775 | 16.636 |
| 0.7756944444444445 | 16.636 |
| 0.7763888888888889 | 16.636 |
| 0.7770833333333332 | 12.257 |
| 0.7777777777777778 | 12.257 |
| 0.7784722222222222 | 12.257 |
| 0.7791666666666667 | 12.257 |
| 0.779861111111111 | 12.257 |
| 0.7805555555555556 | 12.257 |
| 0.78125 | 12.257 |
| 0.7819444444444444 | 7.887 |
| 0.782638888888889 | 7.887 |
| 0.7833333333333333 | 7.887 |
| 0.7840277777777778 | 7.887 |
| 0.7847222222222222 | 7.887 |
| 0.7854166666666668 | 7.887 |
| 0.7861111111111111 | 7.887 |
| 0.7868055555555555 | 3.525 |
| 0.7875 | 3.525 |
| 0.7881944444444445 | 3.525 |
| 0.7888888888888889 | 3.525 |
| 0.7895833333333333 | 3.525 |
| 0.7902777777777777 | 3.525 |
| 0.7909722222222223 | 3.525 |
| 0.7916666666666666 | 3.525 |
| 0.7923611111111111 | 3.525 |
| 0.7930555555555556 | 3.525 |
| 0.7937500000000001 | 3.525 |
| 0.7944444444444444 | 0 |
| 0.7951388888888888 | 0 |
| 0.7958333333333334 | 0 |
| 0.7965277777777778 | 0 |
| 0.7972222222222222 | 0 |
| 0.7979166666666666 | 0 |
| 0.7986111111111112 | 0 |
| 0.7993055555555556 | 0 |
| 0.7999999999999999 | 0 |
| 0.8006944444444444 | 0 |
| 0.8013888888888889 | 0 |
| 0.8020833333333334 | 0 |
| 0.8027777777777777 | 0 |
| 0.8034722222222223 | 0 |
| 0.8041666666666667 | 0 |
| 0.8048611111111111 | 0 |
| 0.8055555555555555 | 0 |
| 0.80625 | 0 |
| 0.8069444444444445 | 0 |
| 0.8076388888888889 | 0 |
| 0.8083333333333332 | 0 |
| 0.8090277777777778 | 0 |
| 0.8097222222222222 | 0 |
| 0.8104166666666667 | 0 |
| 0.811111111111111 | 0 |
| 0.8118055555555556 | 0 |
| 0.8125 | 0 |
| 0.8131944444444444 | 0 |
| 0.813888888888889 | 0 |
| 0.8145833333333333 | 0 |
| 0.8152777777777778 | 0 |
| 0.8159722222222222 | 0 |
| 0.8166666666666668 | 0 |
| 0.8173611111111111 | 0 |
| 0.8180555555555555 | 0 |
| 0.81875 | 0 |
| 0.8194444444444445 | 0 |
| 0.8201388888888889 | 0 |
| 0.8208333333333333 | 0 |
| 0.8215277777777777 | 0 |
| 0.8222222222222223 | 0 |
| 0.8229166666666666 | 0 |
| 0.8236111111111111 | 0 |
| 0.8243055555555556 | 0 |
| 0.8250000000000001 | 0 |
| 0.8256944444444444 | 0 |
| 0.8263888888888888 | 0 |
| 0.8270833333333334 | 0 |
| 0.8277777777777778 | 0 |
| 0.8284722222222222 | 0 |
| 0.8291666666666666 | 0 |
| 0.8298611111111112 | 0 |
| 0.8305555555555556 | 0 |
| 0.8312499999999999 | 0 |
| 0.8319444444444444 | 0 |
| 0.8326388888888889 | 0 |
| 0.8333333333333334 | 0 |
| 0.8340277777777777 | 0 |
| 0.8347222222222223 | 0 |
| 0.8354166666666667 | 0 |
| 0.8361111111111111 | 0 |
| 0.8368055555555555 | 0 |
| 0.8375 | 0 |
| 0.8381944444444445 | 0 |
| 0.8388888888888889 | 0 |
| 0.8395833333333332 | 0 |
| 0.8402777777777778 | 0 |
| 0.8409722222222222 | 0 |
| 0.8416666666666667 | 0 |
| 0.842361111111111 | 0 |
| 0.8430555555555556 | 0 |
| 0.84375 | 0 |
| 0.8444444444444444 | 0 |
| 0.845138888888889 | 0 |
| 0.8458333333333333 | 0 |
| 0.8465277777777778 | 0 |
| 0.8472222222222222 | 0 |
| 0.8479166666666668 | 0 |
| 0.8486111111111111 | 0 |
| 0.8493055555555555 | 0 |
| 0.85 | 0 |
| 0.8506944444444445 | 0 |
| 0.8513888888888889 | 0 |
| 0.8520833333333333 | 0 |
| 0.8527777777777777 | 0 |
| 0.8534722222222223 | 0 |
| 0.8541666666666666 | 0 |
| 0.8548611111111111 | 0 |
| 0.8555555555555556 | 0 |
| 0.8562500000000001 | 0 |
| 0.8569444444444444 | 0 |
| 0.8576388888888888 | 0 |
| 0.8583333333333334 | 0 |
| 0.8590277777777778 | 0 |
| 0.8597222222222222 | 0 |
| 0.8604166666666666 | 0 |
| 0.8611111111111112 | 0 |
| 0.8618055555555556 | 0 |
| 0.8624999999999999 | 0 |
| 0.8631944444444444 | 0 |
| 0.8638888888888889 | 0 |
| 0.8645833333333334 | 0 |
| 0.8652777777777777 | 0 |
| 0.8659722222222223 | 0 |
| 0.8666666666666667 | 0 |
| 0.8673611111111111 | 0 |
| 0.8680555555555555 | 0 |
| 0.86875 | 0 |
| 0.8694444444444445 | 0 |
| 0.8701388888888889 | 0 |
| 0.8708333333333332 | 0 |
| 0.8715277777777778 | 0 |
| 0.8722222222222222 | 0 |
| 0.8729166666666667 | 0 |
| 0.873611111111111 | 0 |
| 0.8743055555555556 | 0 |
| 0.875 | 0 |
| 0.8756944444444444 | 0 |
| 0.876388888888889 | 0 |
| 0.8770833333333333 | 0 |
| 0.8777777777777778 | 0 |
| 0.8784722222222222 | 0 |
| 0.8791666666666668 | 0 |
| 0.8798611111111111 | 0 |
| 0.8805555555555555 | 0 |
| 0.88125 | 0 |
| 0.8819444444444445 | 0 |
| 0.8826388888888889 | 0 |
| 0.8833333333333333 | 0 |
| 0.8840277777777777 | 0 |
| 0.8847222222222223 | 0 |
| 0.8854166666666666 | 0 |
| 0.8861111111111111 | 0 |
| 0.8868055555555556 | 0 |
| 0.8875000000000001 | 0 |
| 0.8881944444444444 | 0 |
| 0.8888888888888888 | 0 |
| 0.8895833333333334 | 0 |
| 0.8902777777777778 | 0 |
| 0.8909722222222222 | 0 |
| 0.8916666666666666 | 0 |
| 0.8923611111111112 | 0 |
| 0.8930555555555556 | 0 |
| 0.8937499999999999 | 0 |
| 0.8944444444444444 | 0 |
| 0.8951388888888889 | 0 |
| 0.8958333333333334 | 0 |
| 0.8965277777777777 | 0 |
| 0.8972222222222223 | 0 |
| 0.8979166666666667 | 0 |
| 0.8986111111111111 | 0 |
| 0.8993055555555555 | 0 |
| 0.9 | 0 |
| 0.9006944444444445 | 0 |
| 0.9013888888888889 | 0 |
| 0.9020833333333332 | 0 |
| 0.9027777777777778 | 0 |
| 0.9034722222222222 | 0 |
| 0.9041666666666667 | 0 |
| 0.904861111111111 | 0 |
| 0.9055555555555556 | 0 |
| 0.90625 | 0 |
| 0.9069444444444444 | 0 |
| 0.907638888888889 | 0 |
| 0.9083333333333333 | 0 |
| 0.9090277777777778 | 0 |
| 0.9097222222222222 | 0 |
| 0.9104166666666668 | 0 |
| 0.9111111111111111 | 0 |
| 0.9118055555555555 | 0 |
| 0.9125 | 0 |
| 0.9131944444444445 | 0 |
| 0.9138888888888889 | 0 |
| 0.9145833333333333 | 0 |
| 0.9152777777777777 | 0 |
| 0.9159722222222223 | 0 |
| 0.9166666666666666 | 0 |
| 0.9173611111111111 | 0 |
| 0.9180555555555556 | 0 |
| 0.9187500000000001 | 0 |
| 0.9194444444444444 | 0 |
| 0.9201388888888888 | 0 |
| 0.9208333333333334 | 0 |
| 0.9215277777777778 | 0 |
| 0.9222222222222222 | 0 |
| 0.9229166666666666 | 0 |
| 0.9236111111111112 | 0 |
| 0.9243055555555556 | 0 |
| 0.9249999999999999 | 0 |
| 0.9256944444444444 | 0 |
| 0.9263888888888889 | 0 |
| 0.9270833333333334 | 0 |
| 0.9277777777777777 | 0 |
| 0.9284722222222223 | 0 |
| 0.9291666666666667 | 0 |
| 0.9298611111111111 | 0 |
| 0.9305555555555555 | 0 |
| 0.93125 | 0 |
| 0.9319444444444445 | 0 |
| 0.9326388888888889 | 0 |
| 0.9333333333333332 | 0 |
| 0.9340277777777778 | 0 |
| 0.9347222222222222 | 0 |
| 0.9354166666666667 | 0 |
| 0.936111111111111 | 0 |
| 0.9368055555555556 | 0 |
| 0.9375 | 0 |
| 0.9381944444444444 | 0 |
| 0.938888888888889 | 0 |
| 0.9395833333333333 | 0 |
| 0.9402777777777778 | 0 |
| 0.9409722222222222 | 0 |
| 0.9416666666666668 | 0 |
| 0.9423611111111111 | 0 |
| 0.9430555555555555 | 0 |
| 0.94375 | 0 |
| 0.9444444444444445 | 0 |
| 0.9451388888888889 | 0 |
| 0.9458333333333333 | 0 |
| 0.9465277777777777 | 0 |
| 0.9472222222222223 | 0 |
| 0.9479166666666666 | 0 |
| 0.9486111111111111 | 0 |
| 0.9493055555555556 | 0 |
| 0.9500000000000001 | 0 |
| 0.9506944444444444 | 0 |
| 0.9513888888888888 | 0 |
| 0.9520833333333334 | 0 |
| 0.9527777777777778 | 0 |
| 0.9534722222222222 | 0 |
| 0.9541666666666666 | 0 |
| 0.9548611111111112 | 0 |
| 0.9555555555555556 | 0 |
| 0.9562499999999999 | 0 |
| 0.9569444444444444 | 0 |
| 0.9576388888888889 | 0 |
| 0.9583333333333334 | 0 |
| 0.9590277777777777 | 0 |
| 0.9597222222222223 | 0 |
| 0.9604166666666667 | 0 |
| 0.9611111111111111 | 0 |
| 0.9618055555555555 | 0 |
| 0.9625 | 0 |
| 0.9631944444444445 | 0 |
| 0.9638888888888889 | 0 |
| 0.9645833333333332 | 0 |
| 0.9652777777777778 | 0 |
| 0.9659722222222222 | 0 |
| 0.9666666666666667 | 0 |
| 0.967361111111111 | 0 |
| 0.9680555555555556 | 0 |
| 0.96875 | 0 |
| 0.9694444444444444 | 0 |
| 0.970138888888889 | 0 |
| 0.9708333333333333 | 0 |
| 0.9715277777777778 | 0 |
| 0.9722222222222222 | 0 |
| 0.9729166666666668 | 0 |
| 0.9736111111111111 | 0 |
| 0.9743055555555555 | 0 |
| 0.975 | 0 |
| 0.9756944444444445 | 0 |
| 0.9763888888888889 | 0 |
| 0.9770833333333333 | 0 |
| 0.9777777777777777 | 0 |
| 0.9784722222222223 | 0 |
| 0.9791666666666666 | 0 |
| 0.9798611111111111 | 0 |
| 0.9805555555555556 | 0 |
| 0.9812500000000001 | 0 |
| 0.9819444444444444 | 0 |
| 0.9826388888888888 | 0 |
| 0.9833333333333334 | 0 |
| 0.9840277777777778 | 0 |
| 0.9847222222222222 | 0 |
| 0.9854166666666666 | 0 |
| 0.9861111111111112 | 0 |
| 0.9868055555555556 | 0 |
| 0.9874999999999999 | 0 |
| 0.9881944444444444 | 0 |
| 0.9888888888888889 | 0 |
| 0.9895833333333334 | 0 |
| 0.9902777777777777 | 0 |
| 0.9909722222222223 | 0 |
| 0.9916666666666667 | 0 |
| 0.9923611111111111 | 0 |
| 0.9930555555555555 | 0 |
| 0.99375 | 0 |
| 0.9944444444444445 | 0 |
| 0.9951388888888889 | 0 |
| 0.9958333333333332 | 0 |
| 0.9965277777777778 | 0 |
| 0.9972222222222222 | 0 |
| 0.9979166666666667 | 0 |
| 0.998611111111111 | 0 |
| 0.9993055555555556 | 0 |